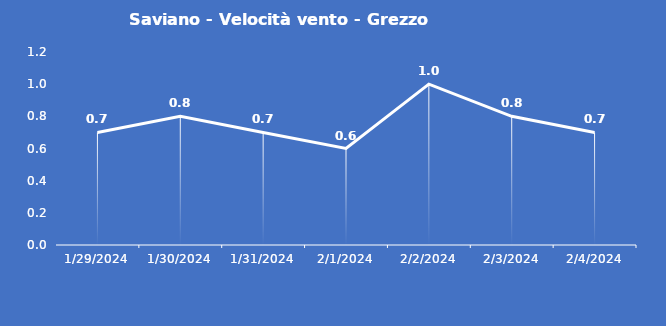
| Category | Saviano - Velocità vento - Grezzo (m/s) |
|---|---|
| 1/29/24 | 0.7 |
| 1/30/24 | 0.8 |
| 1/31/24 | 0.7 |
| 2/1/24 | 0.6 |
| 2/2/24 | 1 |
| 2/3/24 | 0.8 |
| 2/4/24 | 0.7 |